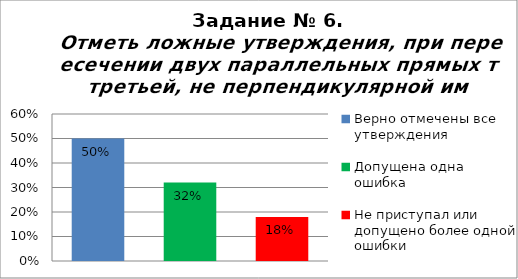
| Category | Отметь ложные утверждения, при пересечении двух параллельных прямых третьей, не перпендикулярной им. |
|---|---|
| Верно отмечены все утверждения | 0.5 |
| Допущена одна ошибка | 0.32 |
| Не приступал или допущено более одной ошибки | 0.18 |